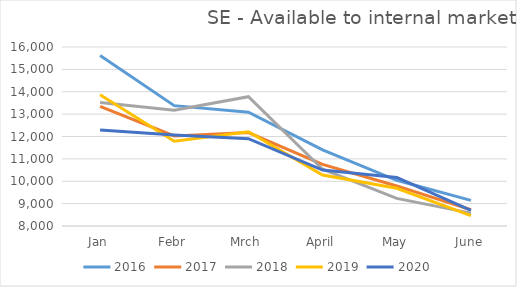
| Category | 2016 | 2017 | 2018 | 2019 | 2020 |
|---|---|---|---|---|---|
| Jan | 15619 | 13349.827 | 13520.497 | 13866.912 | 12291.7 |
| Febr | 13379 | 12025.967 | 13170.822 | 11788.126 | 12061.893 |
| Mrch | 13087 | 12177.756 | 13778.677 | 12212.347 | 11901.657 |
| April | 11399 | 10751.109 | 10538.614 | 10278.959 | 10500.276 |
| May | 10044 | 9790.297 | 9234.409 | 9687.773 | 10168.593 |
| June | 9145 | 8726.392 | 8575.016 | 8460.996 | 8699 |